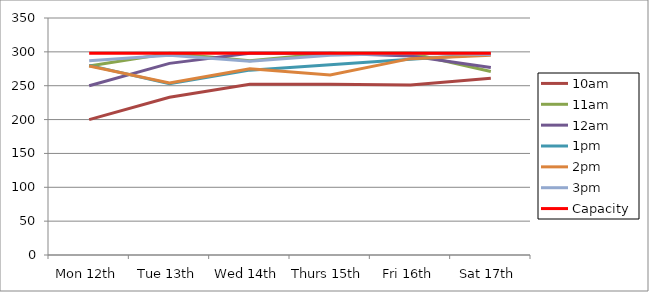
| Category | 9am | 10am | 11am | 12am | 1pm | 2pm | 3pm | 4pm | 5pm | Capacity |
|---|---|---|---|---|---|---|---|---|---|---|
| Mon 12th |  | 200 | 279 | 250 | 280 | 279 | 287 |  |  | 298 |
| Tue 13th |  | 233 | 298 | 283 | 253 | 254 | 295 |  |  | 298 |
| Wed 14th |  | 252 | 287 | 298 | 273 | 275 | 286 |  |  | 298 |
| Thurs 15th |  | 252 | 298 | 298 | 281 | 266 | 295 |  |  | 298 |
| Fri 16th |  | 251 | 298 | 294 | 289 | 290 | 298 |  |  | 298 |
| Sat 17th |  | 261 | 271 | 277 | 297 | 295 | 296 |  |  | 298 |